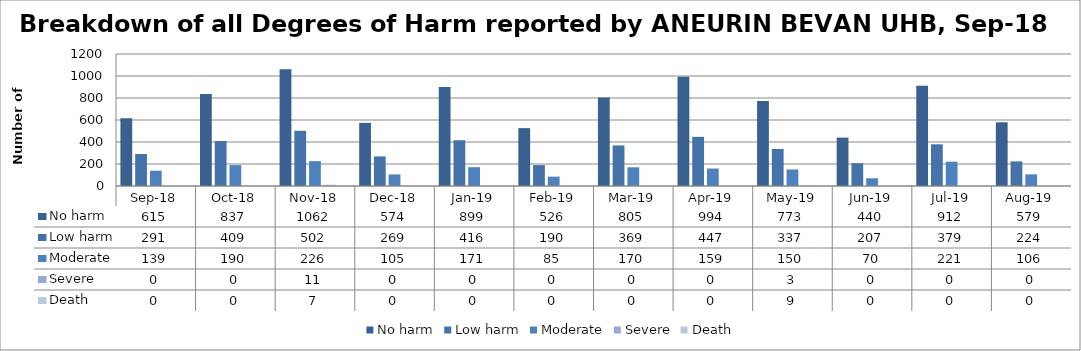
| Category | No harm | Low harm | Moderate | Severe | Death |
|---|---|---|---|---|---|
| Sep-18 | 615 | 291 | 139 | 0 | 0 |
| Oct-18 | 837 | 409 | 190 | 0 | 0 |
| Nov-18 | 1062 | 502 | 226 | 11 | 7 |
| Dec-18 | 574 | 269 | 105 | 0 | 0 |
| Jan-19 | 899 | 416 | 171 | 0 | 0 |
| Feb-19 | 526 | 190 | 85 | 0 | 0 |
| Mar-19 | 805 | 369 | 170 | 0 | 0 |
| Apr-19 | 994 | 447 | 159 | 0 | 0 |
| May-19 | 773 | 337 | 150 | 3 | 9 |
| Jun-19 | 440 | 207 | 70 | 0 | 0 |
| Jul-19 | 912 | 379 | 221 | 0 | 0 |
| Aug-19 | 579 | 224 | 106 | 0 | 0 |